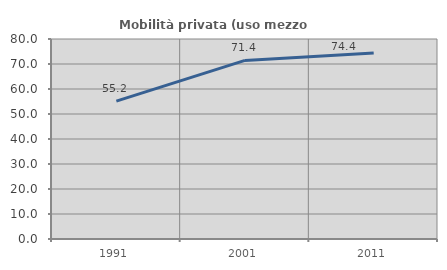
| Category | Mobilità privata (uso mezzo privato) |
|---|---|
| 1991.0 | 55.164 |
| 2001.0 | 71.429 |
| 2011.0 | 74.384 |